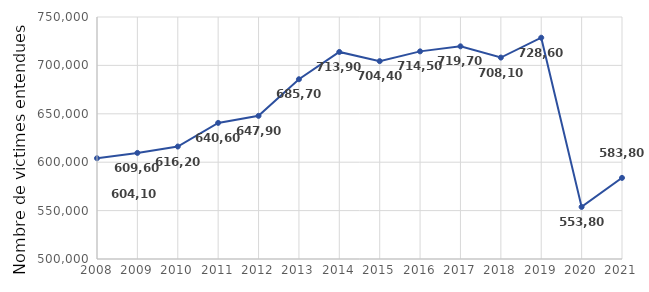
| Category | Series 0 |
|---|---|
| 2008.0 | 604100 |
| 2009.0 | 609600 |
| 2010.0 | 616200 |
| 2011.0 | 640600 |
| 2012.0 | 647900 |
| 2013.0 | 685700 |
| 2014.0 | 713900 |
| 2015.0 | 704400 |
| 2016.0 | 714500 |
| 2017.0 | 719700 |
| 2018.0 | 708100 |
| 2019.0 | 728600 |
| 2020.0 | 553800 |
| 2021.0 | 583800 |